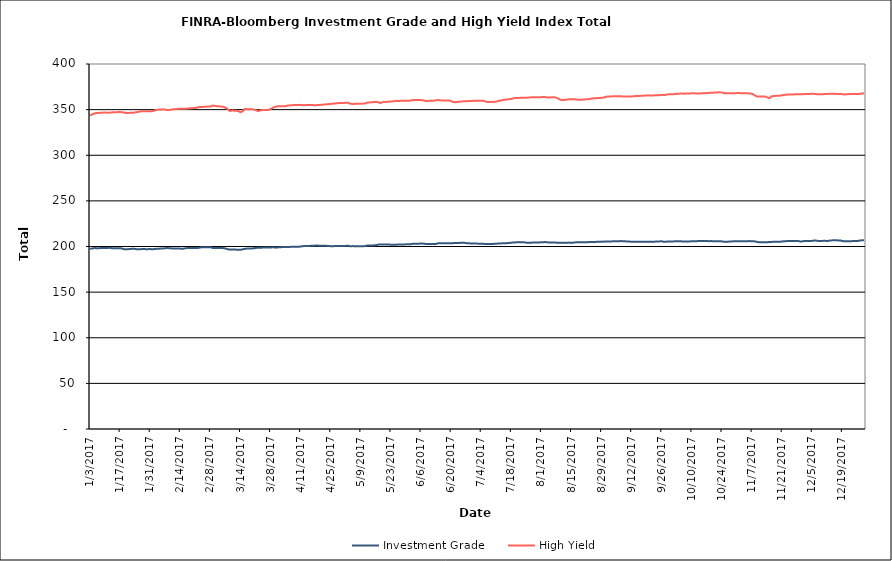
| Category | Investment Grade | High Yield |
|---|---|---|
| 1/3/17 | 197.43 | 343.615 |
| 1/4/17 | 197.758 | 344.832 |
| 1/5/17 | 198.38 | 345.866 |
| 1/6/17 | 198.077 | 346.307 |
| 1/9/17 | 198.327 | 346.697 |
| 1/10/17 | 198.229 | 346.909 |
| 1/11/17 | 198.285 | 346.579 |
| 1/12/17 | 198.625 | 346.694 |
| 1/13/17 | 198.14 | 346.967 |
| 1/17/17 | 198.169 | 347.368 |
| 1/18/17 | 197.652 | 347.15 |
| 1/19/17 | 196.942 | 346.534 |
| 1/20/17 | 196.891 | 346.39 |
| 1/23/17 | 197.622 | 346.514 |
| 1/24/17 | 197.329 | 346.954 |
| 1/25/17 | 196.872 | 347.446 |
| 1/26/17 | 196.877 | 347.852 |
| 1/27/17 | 197.185 | 348.198 |
| 1/30/17 | 197.071 | 348.126 |
| 1/31/17 | 197.244 | 348.14 |
| 2/1/17 | 196.936 | 348.45 |
| 2/2/17 | 197.29 | 348.968 |
| 2/3/17 | 197.513 | 349.807 |
| 2/6/17 | 197.842 | 350.277 |
| 2/7/17 | 198.047 | 350.135 |
| 2/8/17 | 198.355 | 349.51 |
| 2/9/17 | 198.049 | 349.602 |
| 2/10/17 | 197.918 | 350.228 |
| 2/13/17 | 197.874 | 350.803 |
| 2/14/17 | 197.64 | 350.922 |
| 2/15/17 | 197.427 | 350.891 |
| 2/16/17 | 197.929 | 350.971 |
| 2/17/17 | 198.216 | 351.087 |
| 2/21/17 | 198.247 | 351.833 |
| 2/22/17 | 198.308 | 352.379 |
| 2/23/17 | 198.751 | 352.958 |
| 2/24/17 | 199.301 | 352.929 |
| 2/27/17 | 199.267 | 353.359 |
| 2/28/17 | 199.286 | 353.461 |
| 3/1/17 | 198.425 | 354.46 |
| 3/2/17 | 198.224 | 354.143 |
| 3/3/17 | 198.231 | 353.795 |
| 3/6/17 | 198.231 | 353.159 |
| 3/7/17 | 197.839 | 352.055 |
| 3/8/17 | 197.117 | 350.522 |
| 3/9/17 | 196.55 | 348.487 |
| 3/10/17 | 196.694 | 349.078 |
| 3/13/17 | 196.517 | 348.476 |
| 3/14/17 | 196.426 | 347.13 |
| 3/15/17 | 196.905 | 348.321 |
| 3/16/17 | 197.461 | 350.636 |
| 3/17/17 | 197.728 | 350.523 |
| 3/20/17 | 197.976 | 350.244 |
| 3/21/17 | 198.383 | 349.661 |
| 3/22/17 | 198.622 | 348.392 |
| 3/23/17 | 198.587 | 348.921 |
| 3/24/17 | 198.773 | 349.695 |
| 3/27/17 | 199.054 | 349.587 |
| 3/28/17 | 198.938 | 350.707 |
| 3/29/17 | 199.127 | 351.898 |
| 3/30/17 | 198.976 | 353.046 |
| 3/31/17 | 198.967 | 353.575 |
| 4/3/17 | 199.465 | 353.838 |
| 4/4/17 | 199.473 | 353.816 |
| 4/5/17 | 199.484 | 354.476 |
| 4/6/17 | 199.567 | 354.628 |
| 4/7/17 | 199.687 | 354.912 |
| 4/10/17 | 199.62 | 355.105 |
| 4/11/17 | 200.078 | 355.238 |
| 4/12/17 | 200.335 | 354.927 |
| 4/13/17 | 200.61 | 354.929 |
| 4/17/17 | 200.742 | 354.947 |
| 4/18/17 | 201.126 | 354.749 |
| 4/19/17 | 201.039 | 355.092 |
| 4/20/17 | 200.738 | 355.14 |
| 4/21/17 | 200.93 | 355.439 |
| 4/24/17 | 200.6 | 356.018 |
| 4/25/17 | 200.334 | 356.288 |
| 4/26/17 | 200.283 | 356.56 |
| 4/27/17 | 200.577 | 356.729 |
| 4/28/17 | 200.59 | 357.087 |
| 5/1/17 | 200.509 | 357.288 |
| 5/2/17 | 200.667 | 357.643 |
| 5/3/17 | 200.874 | 357.587 |
| 5/4/17 | 200.339 | 356.477 |
| 5/5/17 | 200.425 | 356.226 |
| 5/8/17 | 200.272 | 356.449 |
| 5/9/17 | 200.145 | 356.371 |
| 5/10/17 | 200.396 | 356.613 |
| 5/11/17 | 200.418 | 356.827 |
| 5/12/17 | 201.049 | 357.687 |
| 5/15/17 | 201.225 | 358.284 |
| 5/16/17 | 201.4 | 358.483 |
| 5/17/17 | 202.07 | 358.192 |
| 5/18/17 | 202.097 | 357.132 |
| 5/19/17 | 202.084 | 358.198 |
| 5/22/17 | 202.173 | 358.74 |
| 5/23/17 | 201.965 | 358.83 |
| 5/24/17 | 201.797 | 359.157 |
| 5/25/17 | 201.88 | 359.424 |
| 5/26/17 | 202.142 | 359.498 |
| 5/30/17 | 202.338 | 359.772 |
| 5/31/17 | 202.493 | 359.658 |
| 6/1/17 | 202.403 | 359.892 |
| 6/2/17 | 202.989 | 360.435 |
| 6/5/17 | 202.966 | 360.48 |
| 6/6/17 | 203.324 | 360.493 |
| 6/7/17 | 203.138 | 360.17 |
| 6/8/17 | 202.843 | 359.48 |
| 6/9/17 | 202.71 | 359.563 |
| 6/12/17 | 202.782 | 359.812 |
| 6/13/17 | 202.819 | 360.223 |
| 6/14/17 | 203.663 | 360.576 |
| 6/15/17 | 203.446 | 360.163 |
| 6/16/17 | 203.555 | 359.961 |
| 6/19/17 | 203.462 | 360.106 |
| 6/20/17 | 203.648 | 359.217 |
| 6/21/17 | 203.684 | 358.429 |
| 6/22/17 | 203.8 | 358.065 |
| 6/23/17 | 203.873 | 358.472 |
| 6/26/17 | 204.216 | 359.174 |
| 6/27/17 | 203.689 | 359.208 |
| 6/28/17 | 203.589 | 359.381 |
| 6/29/17 | 203.322 | 359.377 |
| 6/30/17 | 203.285 | 359.583 |
| 7/3/17 | 203.108 | 359.782 |
| 7/5/17 | 202.972 | 359.598 |
| 7/6/17 | 202.698 | 358.856 |
| 7/7/17 | 202.619 | 358.285 |
| 7/10/17 | 202.891 | 358.575 |
| 7/11/17 | 202.912 | 358.677 |
| 7/12/17 | 203.439 | 359.724 |
| 7/13/17 | 203.264 | 359.833 |
| 7/14/17 | 203.603 | 360.614 |
| 7/17/17 | 203.737 | 361.435 |
| 7/18/17 | 204.228 | 361.793 |
| 7/19/17 | 204.34 | 362.37 |
| 7/20/17 | 204.539 | 362.884 |
| 7/21/17 | 204.801 | 362.818 |
| 7/24/17 | 204.668 | 362.997 |
| 7/25/17 | 204.056 | 362.902 |
| 7/26/17 | 204.125 | 363.404 |
| 7/27/17 | 204.134 | 363.405 |
| 7/28/17 | 204.328 | 363.531 |
| 7/31/17 | 204.413 | 363.556 |
| 8/1/17 | 204.707 | 363.713 |
| 8/2/17 | 204.75 | 363.821 |
| 8/3/17 | 204.853 | 363.671 |
| 8/4/17 | 204.488 | 363.324 |
| 8/7/17 | 204.49 | 363.558 |
| 8/8/17 | 204.185 | 363.087 |
| 8/9/17 | 204.147 | 361.804 |
| 8/10/17 | 204.054 | 360.703 |
| 8/11/17 | 204.041 | 360.437 |
| 8/14/17 | 204.266 | 361.371 |
| 8/15/17 | 204.078 | 361.32 |
| 8/16/17 | 204.306 | 361.514 |
| 8/17/17 | 204.556 | 361.293 |
| 8/18/17 | 204.624 | 360.717 |
| 8/21/17 | 204.71 | 361.038 |
| 8/22/17 | 204.563 | 361.391 |
| 8/23/17 | 204.841 | 361.447 |
| 8/24/17 | 204.85 | 361.979 |
| 8/25/17 | 204.999 | 362.377 |
| 8/28/17 | 205.148 | 362.764 |
| 8/29/17 | 205.368 | 362.912 |
| 8/30/17 | 205.298 | 363.254 |
| 8/31/17 | 205.497 | 364.065 |
| 9/1/17 | 205.422 | 364.417 |
| 9/5/17 | 205.84 | 364.655 |
| 9/6/17 | 205.756 | 364.724 |
| 9/7/17 | 205.946 | 364.736 |
| 9/8/17 | 205.79 | 364.407 |
| 9/11/17 | 205.368 | 364.439 |
| 9/12/17 | 205.091 | 364.454 |
| 9/13/17 | 205.087 | 364.749 |
| 9/14/17 | 205.089 | 364.887 |
| 9/15/17 | 205.276 | 364.962 |
| 9/18/17 | 205.242 | 365.376 |
| 9/19/17 | 205.301 | 365.589 |
| 9/20/17 | 205.237 | 365.623 |
| 9/21/17 | 205.125 | 365.342 |
| 9/22/17 | 205.239 | 365.571 |
| 9/25/17 | 205.612 | 365.876 |
| 9/26/17 | 205.635 | 366.23 |
| 9/27/17 | 205.16 | 366 |
| 9/28/17 | 205.243 | 366.276 |
| 9/29/17 | 205.521 | 366.805 |
| 10/2/17 | 205.631 | 367.012 |
| 10/3/17 | 205.83 | 367.419 |
| 10/4/17 | 205.767 | 367.45 |
| 10/5/17 | 205.659 | 367.693 |
| 10/6/17 | 205.474 | 367.479 |
| 10/9/17 | 205.566 | 367.715 |
| 10/10/17 | 205.769 | 367.888 |
| 10/11/17 | 205.702 | 367.873 |
| 10/12/17 | 205.671 | 367.653 |
| 10/13/17 | 206.123 | 367.686 |
| 10/16/17 | 206.097 | 368.033 |
| 10/17/17 | 206.026 | 368.276 |
| 10/18/17 | 205.774 | 368.357 |
| 10/19/17 | 205.998 | 368.629 |
| 10/20/17 | 205.649 | 368.624 |
| 10/23/17 | 205.843 | 368.998 |
| 10/24/17 | 205.565 | 368.765 |
| 10/25/17 | 205.144 | 368.013 |
| 10/26/17 | 205.148 | 367.99 |
| 10/27/17 | 205.331 | 367.842 |
| 10/30/17 | 205.802 | 367.967 |
| 10/31/17 | 205.723 | 368.114 |
| 11/1/17 | 205.824 | 368.183 |
| 11/2/17 | 205.795 | 367.927 |
| 11/3/17 | 205.836 | 368 |
| 11/6/17 | 205.9 | 367.743 |
| 11/7/17 | 205.749 | 367.284 |
| 11/8/17 | 205.649 | 366.063 |
| 11/9/17 | 205.288 | 364.573 |
| 11/10/17 | 204.603 | 364.356 |
| 11/13/17 | 204.652 | 364.318 |
| 11/14/17 | 204.691 | 363.502 |
| 11/15/17 | 204.882 | 362.511 |
| 11/16/17 | 204.979 | 364.571 |
| 11/17/17 | 205.199 | 364.981 |
| 11/20/17 | 205.18 | 365.304 |
| 11/21/17 | 205.516 | 365.757 |
| 11/22/17 | 205.835 | 366.155 |
| 11/24/17 | 205.943 | 366.543 |
| 11/27/17 | 205.966 | 366.761 |
| 11/28/17 | 206.095 | 366.796 |
| 11/29/17 | 205.654 | 366.824 |
| 11/30/17 | 205.486 | 366.767 |
| 12/1/17 | 205.92 | 367.053 |
| 12/4/17 | 205.936 | 367.213 |
| 12/5/17 | 206.193 | 367.502 |
| 12/6/17 | 206.601 | 367.317 |
| 12/7/17 | 206.335 | 366.974 |
| 12/8/17 | 206.076 | 366.87 |
| 12/11/17 | 206.204 | 367.016 |
| 12/12/17 | 206.011 | 367.197 |
| 12/13/17 | 206.421 | 367.425 |
| 12/14/17 | 206.69 | 367.409 |
| 12/15/17 | 206.786 | 367.316 |
| 12/18/17 | 206.647 | 367.124 |
| 12/19/17 | 206.018 | 366.974 |
| 12/20/17 | 205.63 | 366.619 |
| 12/21/17 | 205.761 | 366.887 |
| 12/22/17 | 205.837 | 366.991 |
| 12/26/17 | 205.984 | 367.186 |
| 12/27/17 | 206.535 | 367.226 |
| 12/28/17 | 206.756 | 367.69 |
| 12/29/17 | 206.865 | 367.892 |